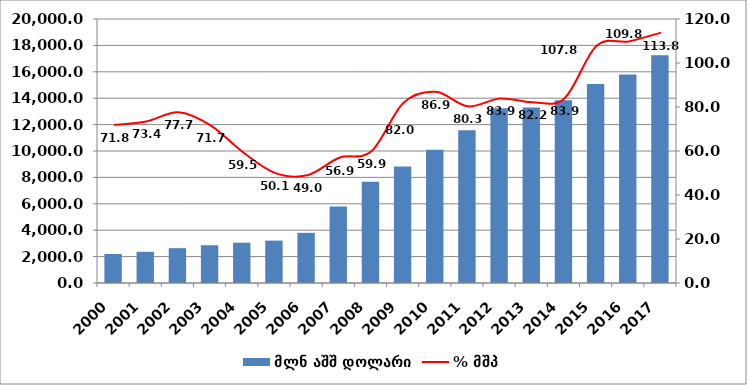
| Category | მლნ აშშ დოლარი |
|---|---|
| 2000.0 | 2195.069 |
| 2001.0 | 2364.019 |
| 2002.0 | 2638.739 |
| 2003.0 | 2861.027 |
| 2004.0 | 3050.926 |
| 2005.0 | 3210.442 |
| 2006.0 | 3800.544 |
| 2007.0 | 5790.241 |
| 2008.0 | 7667.716 |
| 2009.0 | 8826.472 |
| 2010.0 | 10102.737 |
| 2011.0 | 11578.652 |
| 2012.0 | 13242.811 |
| 2013.0 | 13295.547 |
| 2014.0 | 13851.617 |
| 2015.0 | 15083.141 |
| 2016.0 | 15788.793 |
| 2017.0 | 17259.825 |